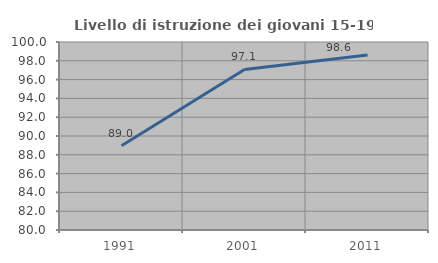
| Category | Livello di istruzione dei giovani 15-19 anni |
|---|---|
| 1991.0 | 88.963 |
| 2001.0 | 97.078 |
| 2011.0 | 98.624 |